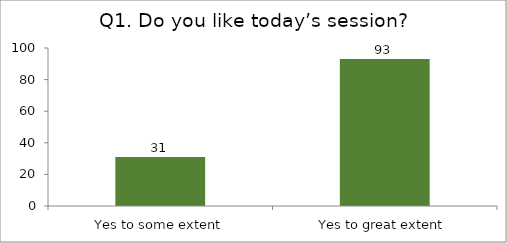
| Category | Q1. Do you like today’s session? |
|---|---|
| Yes to some extent | 31 |
| Yes to great extent | 93 |